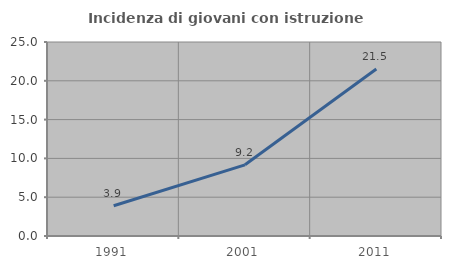
| Category | Incidenza di giovani con istruzione universitaria |
|---|---|
| 1991.0 | 3.901 |
| 2001.0 | 9.171 |
| 2011.0 | 21.521 |